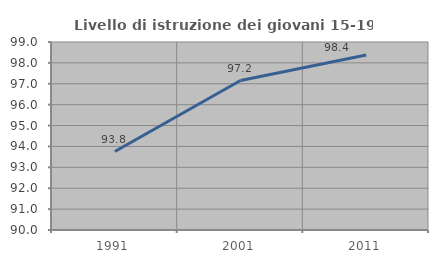
| Category | Livello di istruzione dei giovani 15-19 anni |
|---|---|
| 1991.0 | 93.757 |
| 2001.0 | 97.156 |
| 2011.0 | 98.38 |